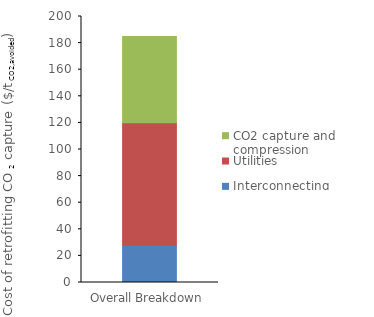
| Category | Interconnecting | Utilities | CO2 capture and compression |
|---|---|---|---|
| 0 | 27.944 | 92.135 | 64.793 |